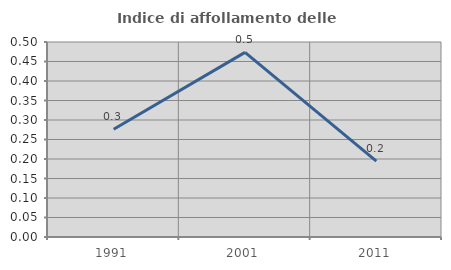
| Category | Indice di affollamento delle abitazioni  |
|---|---|
| 1991.0 | 0.276 |
| 2001.0 | 0.473 |
| 2011.0 | 0.195 |